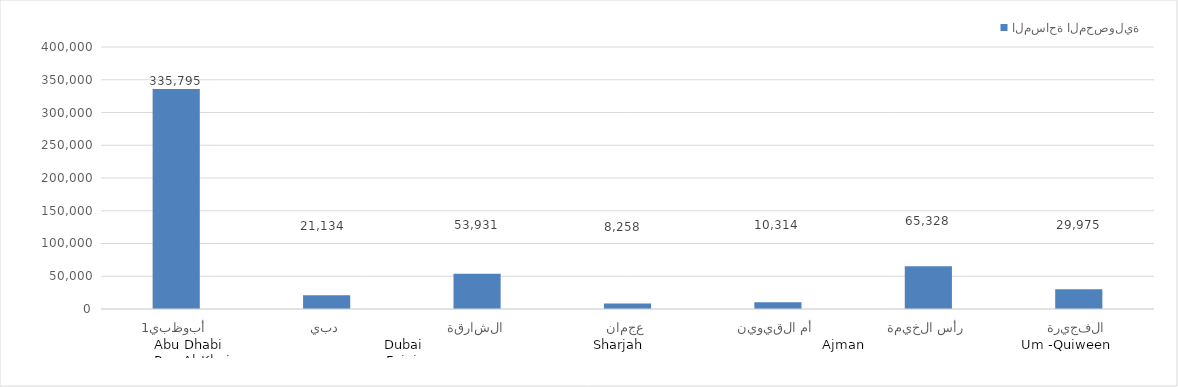
| Category | المساحة المحصولية |
|---|---|
| أبوظبي1 | 335794.8 |
| دبي | 21134.428 |
| الشارقة | 53931.025 |
| عجمان | 8257.596 |
| أم القيوين | 10314.226 |
| رأس الخيمة | 65328.149 |
| الفجيرة | 29974.88 |